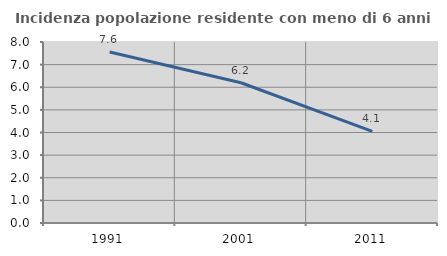
| Category | Incidenza popolazione residente con meno di 6 anni |
|---|---|
| 1991.0 | 7.558 |
| 2001.0 | 6.2 |
| 2011.0 | 4.054 |